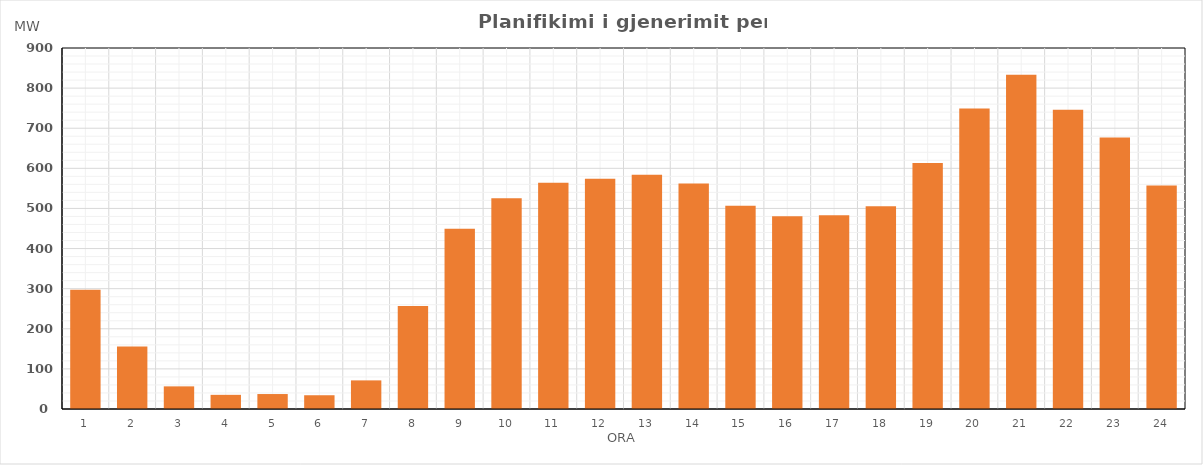
| Category | Max (MW) |
|---|---|
| 0 | 297.087 |
| 1 | 156.127 |
| 2 | 56.429 |
| 3 | 35.3 |
| 4 | 37.3 |
| 5 | 34.3 |
| 6 | 71.338 |
| 7 | 256.757 |
| 8 | 449.071 |
| 9 | 525.3 |
| 10 | 564.3 |
| 11 | 573.843 |
| 12 | 583.842 |
| 13 | 562.3 |
| 14 | 506.483 |
| 15 | 480.3 |
| 16 | 483.3 |
| 17 | 505.3 |
| 18 | 613.3 |
| 19 | 749.3 |
| 20 | 833.478 |
| 21 | 746.037 |
| 22 | 676.566 |
| 23 | 557.3 |